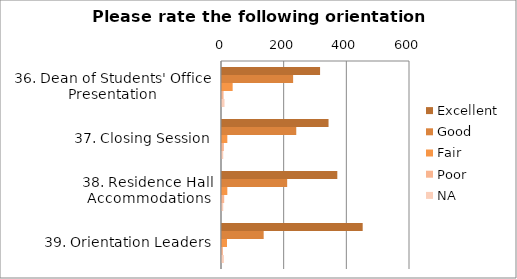
| Category | Excellent | Good | Fair | Poor | NA |
|---|---|---|---|---|---|
| 36. Dean of Students' Office Presentation | 313 | 227 | 34 | 5 | 8 |
| 37. Closing Session | 340 | 237 | 17 | 6 | 4 |
| 38. Residence Hall Accommodations | 368 | 208 | 17 | 7 | 4 |
| 39. Orientation Leaders | 449 | 133 | 16 | 3 | 6 |